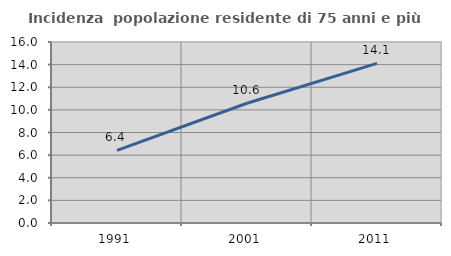
| Category | Incidenza  popolazione residente di 75 anni e più |
|---|---|
| 1991.0 | 6.421 |
| 2001.0 | 10.588 |
| 2011.0 | 14.11 |